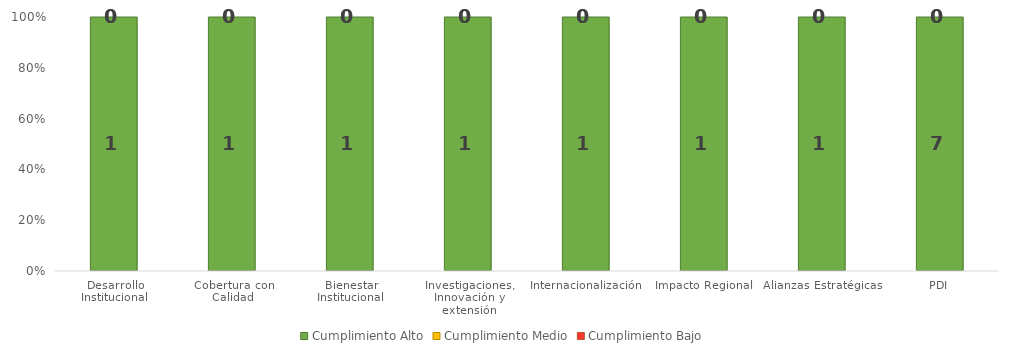
| Category | Cumplimiento Alto | Cumplimiento Medio | Cumplimiento Bajo |
|---|---|---|---|
| Desarrollo Institucional | 1 | 0 | 0 |
| Cobertura con Calidad | 1 | 0 | 0 |
| Bienestar Institucional | 1 | 0 | 0 |
| Investigaciones, Innovación y extensión | 1 | 0 | 0 |
| Internacionalización | 1 | 0 | 0 |
| Impacto Regional | 1 | 0 | 0 |
| Alianzas Estratégicas | 1 | 0 | 0 |
| PDI | 7 | 0 | 0 |